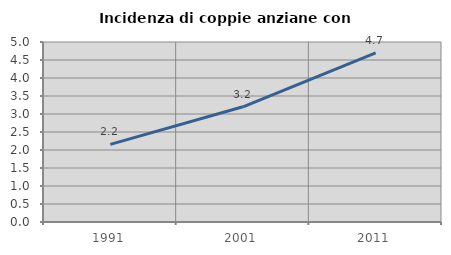
| Category | Incidenza di coppie anziane con figli |
|---|---|
| 1991.0 | 2.156 |
| 2001.0 | 3.2 |
| 2011.0 | 4.7 |